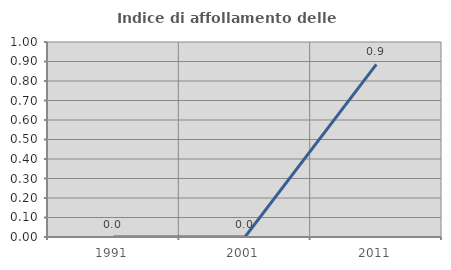
| Category | Indice di affollamento delle abitazioni  |
|---|---|
| 1991.0 | 0 |
| 2001.0 | 0 |
| 2011.0 | 0.885 |